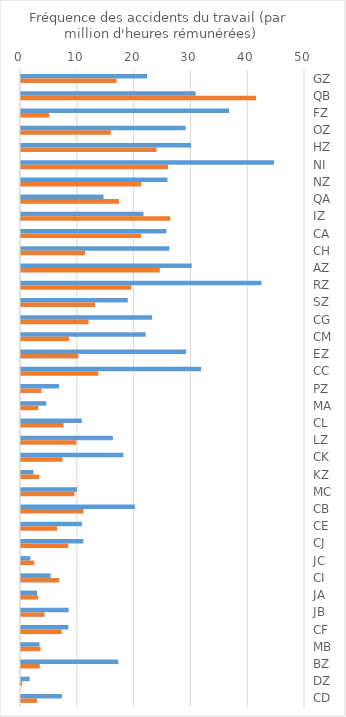
| Category | Series 0 | Series 1 |
|---|---|---|
| GZ | 22.192 | 16.813 |
| QB | 30.751 | 41.39 |
| FZ | 36.627 | 4.952 |
| OZ | 28.99 | 15.832 |
| HZ | 29.945 | 23.862 |
| NI | 44.543 | 25.889 |
| NZ | 25.769 | 21.175 |
| QA | 14.521 | 17.233 |
| IZ | 21.567 | 26.28 |
| CA | 25.596 | 21.123 |
| CH | 26.128 | 11.282 |
| AZ | 30.052 | 24.439 |
| RZ | 42.339 | 19.419 |
| SZ | 18.792 | 13.037 |
| CG | 23.081 | 11.908 |
| CM | 21.939 | 8.442 |
| EZ | 29.08 | 10.086 |
| CC | 31.712 | 13.635 |
| PZ | 6.683 | 3.598 |
| MA | 4.46 | 3.045 |
| CL | 10.707 | 7.496 |
| LZ | 16.17 | 9.755 |
| CK | 18.028 | 7.297 |
| KZ | 2.18 | 3.226 |
| MC | 9.864 | 9.396 |
| CB | 20.05 | 10.999 |
| CE | 10.716 | 6.348 |
| CJ | 10.958 | 8.316 |
| JC | 1.662 | 2.356 |
| CI | 5.211 | 6.725 |
| JA | 2.815 | 3.015 |
| JB | 8.379 | 4.134 |
| CF | 8.342 | 7.153 |
| MB | 3.257 | 3.461 |
| BZ | 17.127 | 3.299 |
| DZ | 1.524 | 0.195 |
| CD | 7.206 | 2.816 |